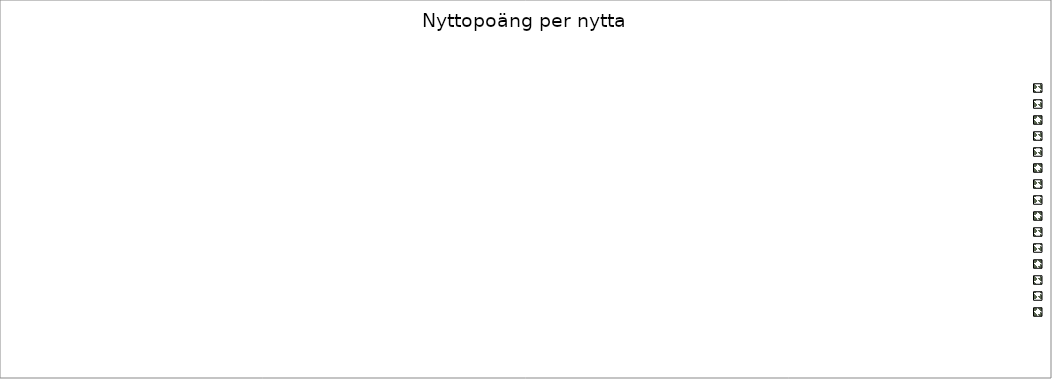
| Category | Nyttopoäng |
|---|---|
| 0 | 0 |
| 1 | 0 |
| 2 | 0 |
| 3 | 0 |
| 4 | 0 |
| 5 | 0 |
| 6 | 0 |
| 7 | 0 |
| 8 | 0 |
| 9 | 0 |
| 10 | 0 |
| 11 | 0 |
| 12 | 0 |
| 13 | 0 |
| 14 | 0 |